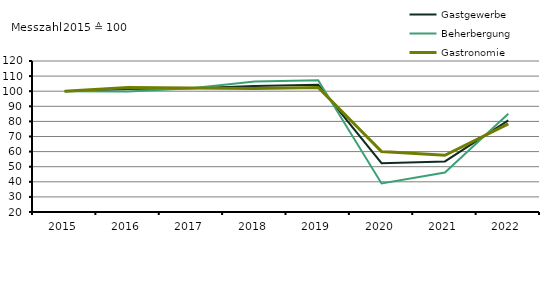
| Category | Gastgewerbe | Beherbergung | Gastronomie |
|---|---|---|---|
| 2015.0 | 100 | 100 | 100 |
| 2016.0 | 101.4 | 99.8 | 102.4 |
| 2017.0 | 102 | 101.9 | 102.2 |
| 2018.0 | 103.5 | 106.5 | 101.8 |
| 2019.0 | 104.2 | 107.3 | 102.5 |
| 2020.0 | 52.3 | 38.9 | 60 |
| 2021.0 | 53.509 | 46.097 | 57.572 |
| 2022.0 | 80.668 | 85.036 | 78.317 |